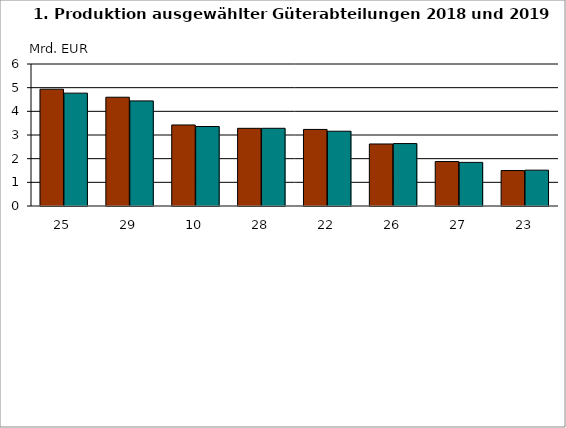
| Category | Series 0 | Series 1 |
|---|---|---|
| 25.0 | 4.936 | 4.769 |
| 29.0 | 4.596 | 4.441 |
| 10.0 | 3.424 | 3.359 |
| 28.0 | 3.282 | 3.283 |
| 22.0 | 3.236 | 3.159 |
| 26.0 | 2.621 | 2.638 |
| 27.0 | 1.878 | 1.843 |
| 23.0 | 1.498 | 1.514 |